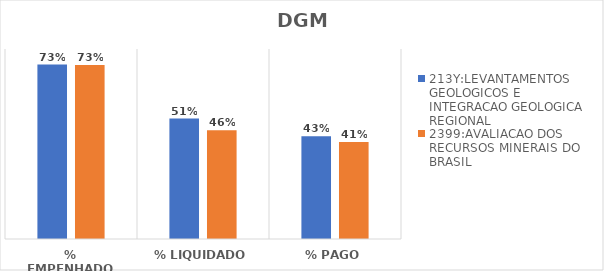
| Category | 213Y:LEVANTAMENTOS GEOLOGICOS E INTEGRACAO GEOLOGICA REGIONAL | 2399:AVALIACAO DOS RECURSOS MINERAIS DO BRASIL |
|---|---|---|
| % EMPENHADO | 0.734 | 0.732 |
| % LIQUIDADO | 0.507 | 0.458 |
| % PAGO | 0.433 | 0.409 |